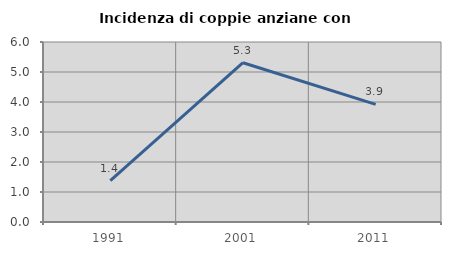
| Category | Incidenza di coppie anziane con figli |
|---|---|
| 1991.0 | 1.383 |
| 2001.0 | 5.308 |
| 2011.0 | 3.922 |